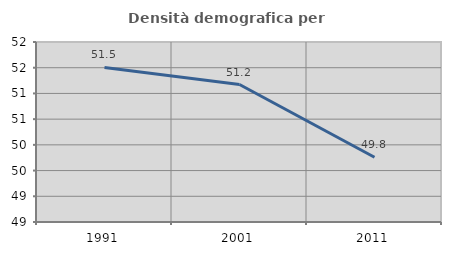
| Category | Densità demografica |
|---|---|
| 1991.0 | 51.504 |
| 2001.0 | 51.173 |
| 2011.0 | 49.76 |